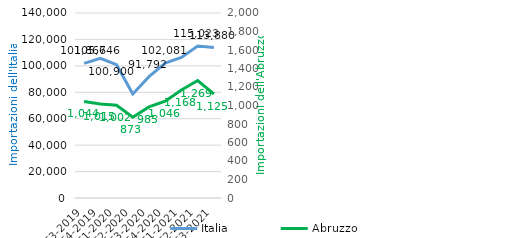
| Category | Italia |
|---|---|
| T3-2019 | 101865.82 |
| T4-2019 | 105746.413 |
| T1-2020 | 100899.706 |
| T2-2020 | 78655.118 |
| T3-2020 | 91792.247 |
| T4-2020 | 102081.279 |
| T1-2021 | 106375.017 |
| T2-2021 | 115023.114 |
| T3-2021 | 113879.752 |